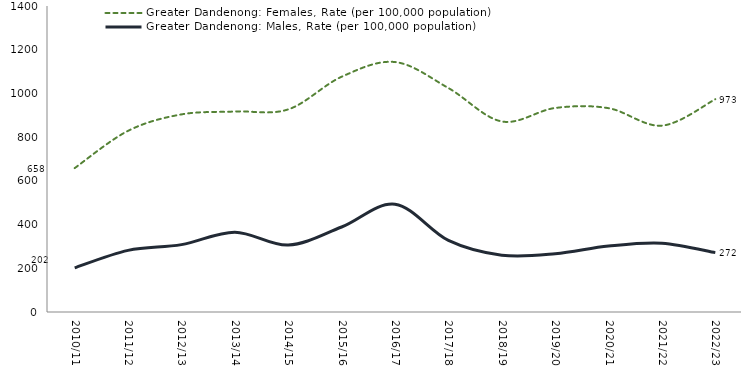
| Category | Greater Dandenong: Females, Rate (per 100,000 population) | Greater Dandenong: Males, Rate (per 100,000 population) |
|---|---|---|
| 2010/11 | 658.372 | 201.92 |
| 2011/12 | 828.944 | 281.925 |
| 2012/13 | 904.064 | 308.267 |
| 2013/14 | 917.35 | 365.304 |
| 2014/15 | 926.979 | 306.318 |
| 2015/16 | 1076.346 | 388.899 |
| 2016/17 | 1143.591 | 493.415 |
| 2017/18 | 1024.685 | 327.753 |
| 2018/19 | 871.795 | 260.094 |
| 2019/20 | 933.407 | 266.348 |
| 2020/21 | 932.514 | 301.731 |
| 2021/22 | 852.596 | 314.824 |
| 2022/23 | 973.456 | 271.662 |